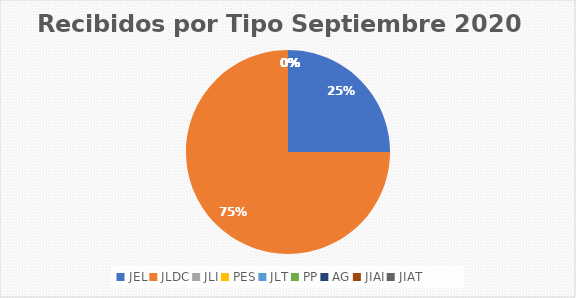
| Category | Series 0 |
|---|---|
| JEL | 2 |
| JLDC | 6 |
| JLI | 0 |
| PES | 0 |
| JLT | 0 |
| PP | 0 |
| AG | 0 |
| JIAI | 0 |
| JIAT | 0 |